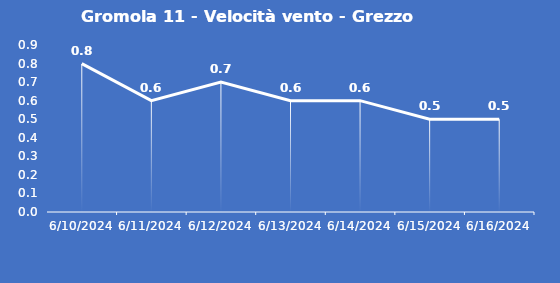
| Category | Gromola 11 - Velocità vento - Grezzo (m/s) |
|---|---|
| 6/10/24 | 0.8 |
| 6/11/24 | 0.6 |
| 6/12/24 | 0.7 |
| 6/13/24 | 0.6 |
| 6/14/24 | 0.6 |
| 6/15/24 | 0.5 |
| 6/16/24 | 0.5 |